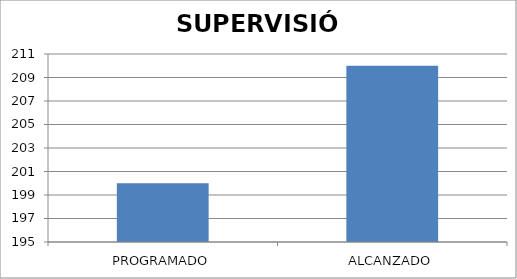
| Category | SUPERVISIÓN |
|---|---|
| PROGRAMADO | 200 |
| ALCANZADO | 210 |